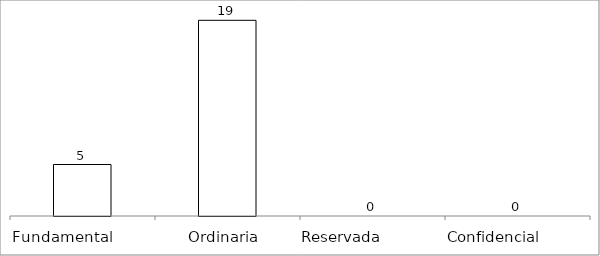
| Category | Series 0 |
|---|---|
| Fundamental         | 5 |
| Ordinaria  | 19 |
| Reservada               | 0 |
| Confidencial             | 0 |